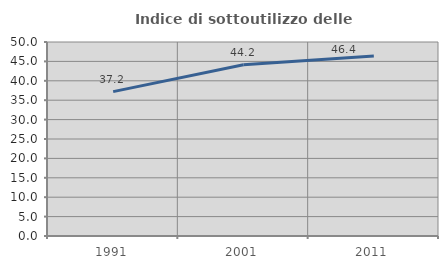
| Category | Indice di sottoutilizzo delle abitazioni  |
|---|---|
| 1991.0 | 37.217 |
| 2001.0 | 44.159 |
| 2011.0 | 46.369 |